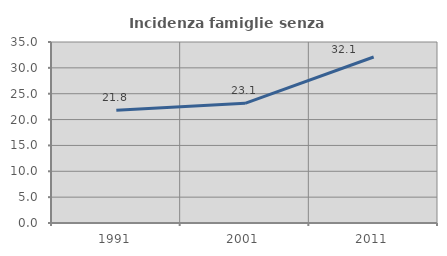
| Category | Incidenza famiglie senza nuclei |
|---|---|
| 1991.0 | 21.779 |
| 2001.0 | 23.139 |
| 2011.0 | 32.103 |